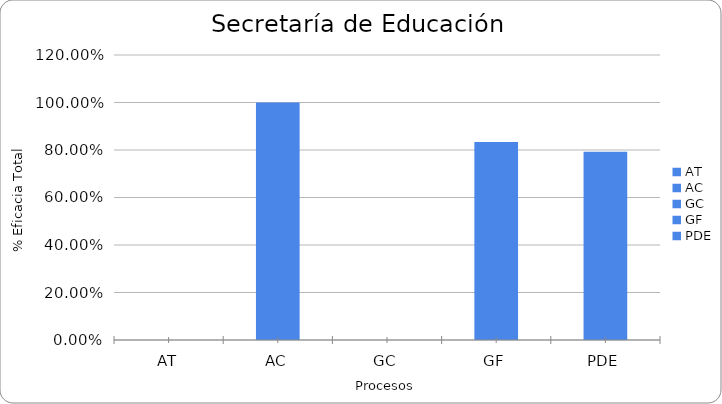
| Category | % Eficacia total |
|---|---|
| AT | 0 |
| AC | 1 |
| GC | 0 |
| GF | 0.833 |
| PDE | 0.793 |